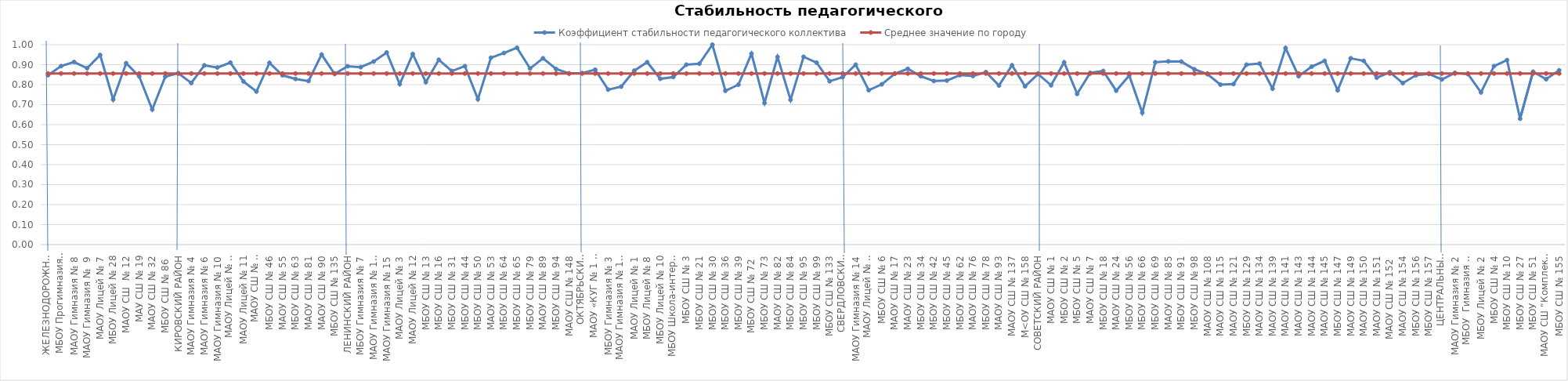
| Category | Коэффициент стабильности педагогического коллектива | Среднее значение по городу |
|---|---|---|
| ЖЕЛЕЗНОДОРОЖНЫЙ РАЙОН | 0.847 | 0.856 |
| МБОУ Прогимназия  № 131 | 0.893 | 0.856 |
| МАОУ Гимназия № 8 | 0.914 | 0.856 |
| МАОУ Гимназия №  9 | 0.882 | 0.856 |
| МАОУ Лицей № 7 | 0.948 | 0.856 |
| МБОУ Лицей № 28 | 0.725 | 0.856 |
| МАОУ СШ  № 12 | 0.907 | 0.856 |
| МАУ СШ № 19 | 0.841 | 0.856 |
| МАОУ СШ № 32 | 0.676 | 0.856 |
| МБОУ СШ № 86  | 0.84 | 0.856 |
| КИРОВСКИЙ РАЙОН | 0.857 | 0.856 |
| МАОУ Гимназия № 4 | 0.808 | 0.856 |
| МАОУ Гимназия № 6 | 0.897 | 0.856 |
| МАОУ Гимназия № 10 | 0.886 | 0.856 |
| МАОУ Лицей № 6 "Перспектива" | 0.91 | 0.856 |
| МАОУ Лицей № 11 | 0.816 | 0.856 |
| МАОУ СШ № 8 "Созидание" | 0.766 | 0.856 |
| МБОУ СШ № 46 | 0.909 | 0.856 |
| МАОУ СШ № 55 | 0.847 | 0.856 |
| МБОУ СШ № 63 | 0.829 | 0.856 |
| МАОУ СШ № 81 | 0.818 | 0.856 |
| МАОУ СШ № 90 | 0.951 | 0.856 |
| МБОУ СШ № 135 | 0.854 | 0.856 |
| ЛЕНИНСКИЙ РАЙОН | 0.892 | 0.856 |
| МБОУ Гимназия № 7 | 0.888 | 0.856 |
| МАОУ Гимназия № 11  | 0.916 | 0.856 |
| МАОУ Гимназия № 15 | 0.961 | 0.856 |
| МАОУ Лицей № 3 | 0.803 | 0.856 |
| МАОУ Лицей № 12 | 0.953 | 0.856 |
| МБОУ СШ № 13 | 0.812 | 0.856 |
| МБОУ СШ № 16 | 0.925 | 0.856 |
| МБОУ СШ № 31 | 0.868 | 0.856 |
| МБОУ СШ № 44 | 0.893 | 0.856 |
| МБОУ СШ № 50 | 0.727 | 0.856 |
| МАОУ СШ № 53 | 0.935 | 0.856 |
| МБОУ СШ № 64 | 0.958 | 0.856 |
| МБОУ СШ № 65 | 0.985 | 0.856 |
| МБОУ СШ № 79 | 0.881 | 0.856 |
| МАОУ СШ № 89 | 0.932 | 0.856 |
| МБОУ СШ № 94 | 0.878 | 0.856 |
| МАОУ СШ № 148 | 0.856 | 0.856 |
| ОКТЯБРЬСКИЙ РАЙОН | 0.858 | 0.856 |
| МАОУ «КУГ № 1 – Универс» | 0.875 | 0.856 |
| МБОУ Гимназия № 3 | 0.775 | 0.856 |
| МАОУ Гимназия № 13 "Академ" | 0.79 | 0.856 |
| МАОУ Лицей № 1 | 0.87 | 0.856 |
| МБОУ Лицей № 8 | 0.912 | 0.856 |
| МБОУ Лицей № 10 | 0.829 | 0.856 |
| МБОУ Школа-интернат № 1 | 0.838 | 0.856 |
| МБОУ СШ № 3 | 0.9 | 0.856 |
| МБОУ СШ № 21 | 0.905 | 0.856 |
| МБОУ СШ № 30 | 1 | 0.856 |
| МБОУ СШ № 36 | 0.769 | 0.856 |
| МБОУ СШ № 39 | 0.8 | 0.856 |
| МБОУ СШ № 72  | 0.955 | 0.856 |
| МБОУ СШ № 73 | 0.708 | 0.856 |
| МАОУ СШ № 82 | 0.939 | 0.856 |
| МБОУ СШ № 84 | 0.724 | 0.856 |
| МБОУ СШ № 95 | 0.939 | 0.856 |
| МБОУ СШ № 99 | 0.91 | 0.856 |
| МБОУ СШ № 133 | 0.817 | 0.856 |
| СВЕРДЛОВСКИЙ РАЙОН | 0.838 | 0.856 |
| МАОУ Гимназия № 14 | 0.9 | 0.856 |
| МАОУ Лицей № 9 "Лидер" | 0.772 | 0.856 |
| МБОУ СШ № 6 | 0.802 | 0.856 |
| МАОУ СШ № 17 | 0.855 | 0.856 |
| МАОУ СШ № 23 | 0.879 | 0.856 |
| МБОУ СШ № 34 | 0.842 | 0.856 |
| МБОУ СШ № 42 | 0.818 | 0.856 |
| МБОУ СШ № 45 | 0.821 | 0.856 |
| МБОУ СШ № 62 | 0.848 | 0.856 |
| МАОУ СШ № 76 | 0.843 | 0.856 |
| МБОУ СШ № 78 | 0.863 | 0.856 |
| МАОУ СШ № 93 | 0.795 | 0.856 |
| МАОУ СШ № 137 | 0.897 | 0.856 |
| М<ОУ СШ № 158 | 0.792 | 0.856 |
| СОВЕТСКИЙ РАЙОН | 0.853 | 0.856 |
| МАОУ СШ № 1 | 0.797 | 0.856 |
| МБОУ СШ № 2 | 0.912 | 0.856 |
| МБОУ СШ № 5 | 0.754 | 0.856 |
| МАОУ СШ № 7 | 0.859 | 0.856 |
| МБОУ СШ № 18 | 0.868 | 0.856 |
| МАОУ СШ № 24 | 0.77 | 0.856 |
| МБОУ СШ № 56 | 0.846 | 0.856 |
| МБОУ СШ № 66 | 0.66 | 0.856 |
| МБОУ СШ № 69 | 0.912 | 0.856 |
| МАОУ СШ № 85 | 0.917 | 0.856 |
| МБОУ СШ № 91 | 0.915 | 0.856 |
| МБОУ СШ № 98 | 0.877 | 0.856 |
| МАОУ СШ № 108 | 0.853 | 0.856 |
| МАОУ СШ № 115 | 0.8 | 0.856 |
| МАОУ СШ № 121 | 0.803 | 0.856 |
| МБОУ СШ № 129 | 0.9 | 0.856 |
| МАОУ СШ № 134 | 0.905 | 0.856 |
| МАОУ СШ № 139 | 0.78 | 0.856 |
| МАОУ СШ № 141 | 0.983 | 0.856 |
| МАОУ СШ № 143 | 0.842 | 0.856 |
| МАОУ СШ № 144 | 0.89 | 0.856 |
| МАОУ СШ № 145 | 0.919 | 0.856 |
| МБОУ СШ № 147 | 0.772 | 0.856 |
| МАОУ СШ № 149 | 0.932 | 0.856 |
| МАОУ СШ № 150 | 0.919 | 0.856 |
| МАОУ СШ № 151 | 0.835 | 0.856 |
| МАОУ СШ № 152  | 0.862 | 0.856 |
| МАОУ СШ № 154 | 0.808 | 0.856 |
| МБОУ СШ № 156 | 0.847 | 0.856 |
| МБОУ СШ № 157 | 0.854 | 0.856 |
| ЦЕНТРАЛЬНЫЙ РАЙОН | 0.826 | 0.856 |
| МАОУ Гимназия № 2 | 0.859 | 0.856 |
| МБОУ  Гимназия № 16 | 0.853 | 0.856 |
| МБОУ Лицей № 2 | 0.761 | 0.856 |
| МБОУ СШ № 4 | 0.893 | 0.856 |
| МБОУ СШ № 10 | 0.923 | 0.856 |
| МБОУ СШ № 27 | 0.63 | 0.856 |
| МБОУ СШ № 51 | 0.865 | 0.856 |
| МАОУ СШ "Комплекс "Покровский" | 0.827 | 0.856 |
| МБОУ СШ № 155 | 0.872 | 0.856 |